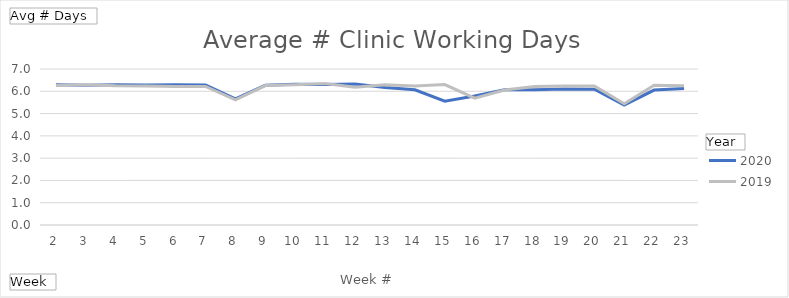
| Category | 2020 | 2019 |
|---|---|---|
| 2 | 6.29 | 6.258 |
| 3 | 6.269 | 6.29 |
| 4 | 6.29 | 6.247 |
| 5 | 6.28 | 6.237 |
| 6 | 6.29 | 6.215 |
| 7 | 6.28 | 6.215 |
| 8 | 5.656 | 5.613 |
| 9 | 6.269 | 6.258 |
| 10 | 6.312 | 6.29 |
| 11 | 6.301 | 6.344 |
| 12 | 6.323 | 6.183 |
| 13 | 6.172 | 6.29 |
| 14 | 6.065 | 6.237 |
| 15 | 5.559 | 6.301 |
| 16 | 5.785 | 5.688 |
| 17 | 6.065 | 6.054 |
| 18 | 6.065 | 6.215 |
| 19 | 6.108 | 6.237 |
| 20 | 6.097 | 6.237 |
| 21 | 5.387 | 5.441 |
| 22 | 6.054 | 6.269 |
| 23 | 6.129 | 6.247 |